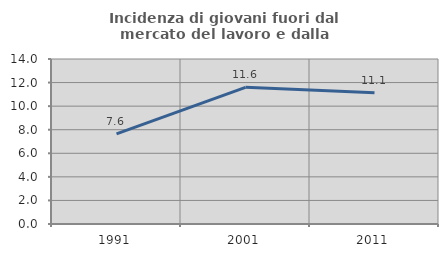
| Category | Incidenza di giovani fuori dal mercato del lavoro e dalla formazione  |
|---|---|
| 1991.0 | 7.647 |
| 2001.0 | 11.598 |
| 2011.0 | 11.133 |